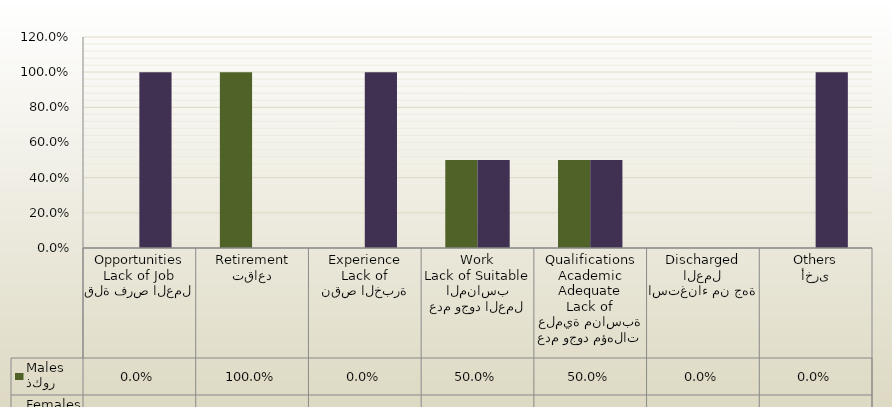
| Category | ذكور
Males | اناث
Females |
|---|---|---|
| قلة فرص العمل
Lack of Job Opportunities | 0 | 1 |
| تقاعد
Retirement | 1 | 0 |
| نقص الخبرة
Lack of Experience | 0 | 1 |
| عدم وجود العمل المناسب
Lack of Suitable Work | 0.5 | 0.5 |
| عدم وجود مؤهلات علمية مناسبة
Lack of Adequate Academic Qualifications | 0.5 | 0.5 |
| استغناء من جهة العمل
Discharged | 0 | 0 |
| أخرى
Others | 0 | 1 |